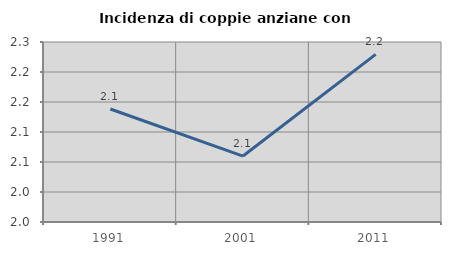
| Category | Incidenza di coppie anziane con figli |
|---|---|
| 1991.0 | 2.138 |
| 2001.0 | 2.06 |
| 2011.0 | 2.229 |